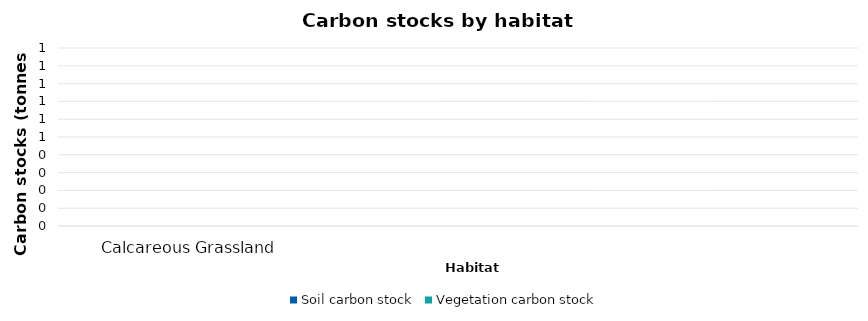
| Category | Soil carbon stock | Vegetation carbon stock |
|---|---|---|
| Calcareous Grassland | 0 | 0 |
|   | 0 | 0 |
|   | 0 | 0 |